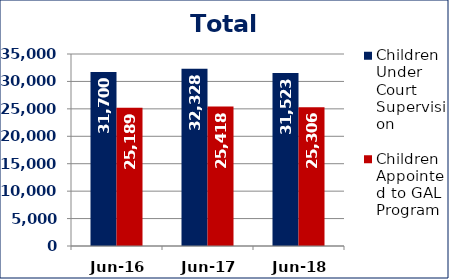
| Category | Children Under Court Supervision  | Children Appointed to GAL Program  |
|---|---|---|
| Jun-16 | 31700 | 25189 |
| Jun-17 | 32328 | 25418 |
| Jun-18 | 31523 | 25306 |